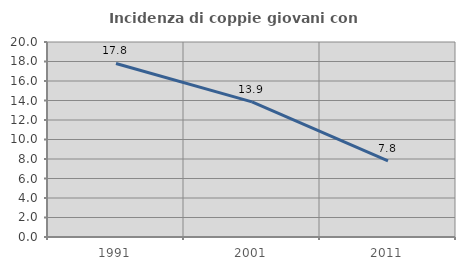
| Category | Incidenza di coppie giovani con figli |
|---|---|
| 1991.0 | 17.799 |
| 2001.0 | 13.858 |
| 2011.0 | 7.819 |